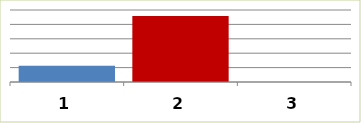
| Category | Series 0 |
|---|---|
| 0 | 1128468 |
| 1 | 4577732 |
| 2 | 0 |